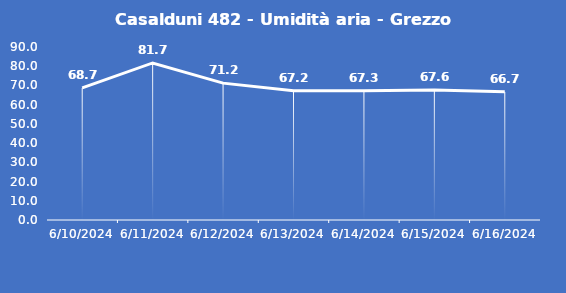
| Category | Casalduni 482 - Umidità aria - Grezzo (%) |
|---|---|
| 6/10/24 | 68.7 |
| 6/11/24 | 81.7 |
| 6/12/24 | 71.2 |
| 6/13/24 | 67.2 |
| 6/14/24 | 67.3 |
| 6/15/24 | 67.6 |
| 6/16/24 | 66.7 |